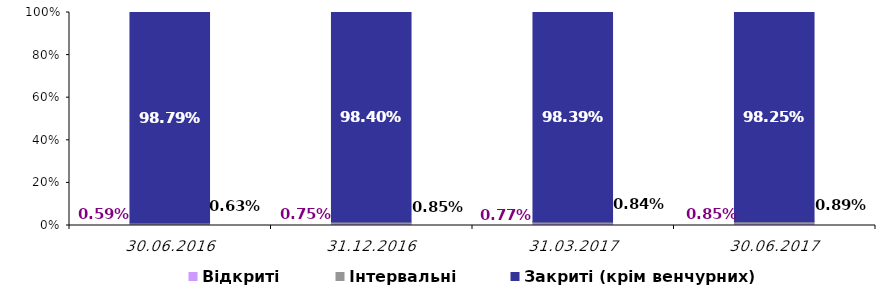
| Category | Відкриті | Інтервальні | Закриті (крім венчурних) |
|---|---|---|---|
| 30.06.2016 | 0.006 | 0.006 | 0.988 |
| 31.12.2016 | 0.008 | 0.008 | 0.984 |
| 31.03.2017 | 0.008 | 0.008 | 0.984 |
| 30.06.2017 | 0.009 | 0.009 | 0.983 |